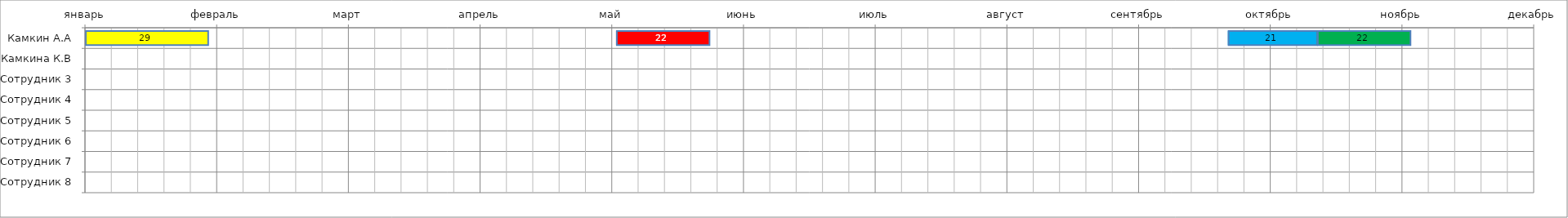
| Category | Столбец1 | Продолжи- тельность1, дней | Столбец2 | Продолжи- тельность2, дней | Столбец6 | Продолжи- тельность3, дней | Столбец10 | Продолжи- тельность4, дней |
|---|---|---|---|---|---|---|---|---|
| Камкин А.А | 1 | 29 | 96 | 22 | 122 | 21 | 0 | 22 |
| Камкина К.В | -43830 | 0 | 0 | 0 | 0 | 0 | 0 | 0 |
| Сотрудник 3 | -43830 | 0 | 0 | 0 | 0 | 0 | 0 | 0 |
| Сотрудник 4 | -43830 | 0 | 0 | 0 | 0 | 0 | 0 | 0 |
| Сотрудник 5 | -43830 | 0 | 0 | 0 | 0 | 0 | 0 | 0 |
| Сотрудник 6 | -43830 | 0 | 0 | 0 | 0 | 0 | 0 | 0 |
| Сотрудник 7 | -43830 | 0 | 0 | 0 | 0 | 0 | 0 | 0 |
| Сотрудник 8 | -43830 | 0 | 0 | 0 | 0 | 0 | 0 | 0 |